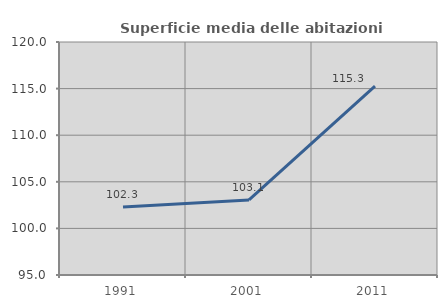
| Category | Superficie media delle abitazioni occupate |
|---|---|
| 1991.0 | 102.294 |
| 2001.0 | 103.053 |
| 2011.0 | 115.262 |